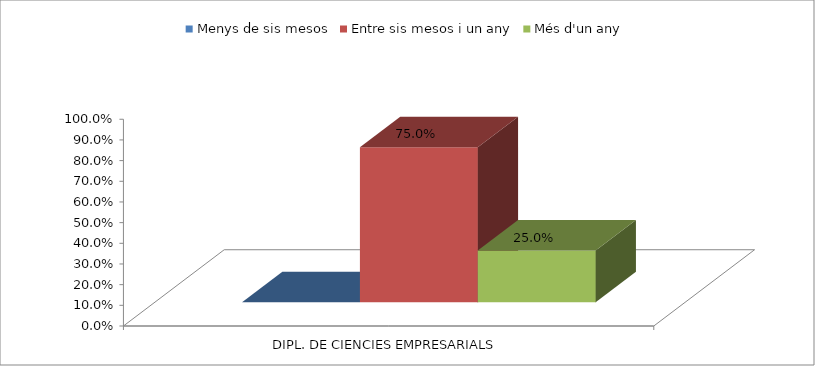
| Category | Menys de sis mesos | Entre sis mesos i un any | Més d'un any |
|---|---|---|---|
| DIPL. DE CIENCIES EMPRESARIALS | 0 | 0.75 | 0.25 |